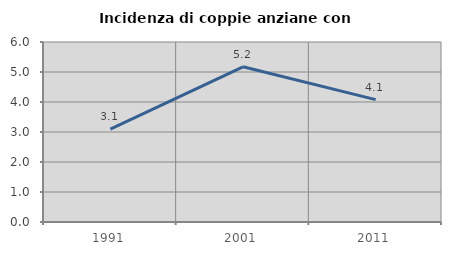
| Category | Incidenza di coppie anziane con figli |
|---|---|
| 1991.0 | 3.093 |
| 2001.0 | 5.172 |
| 2011.0 | 4.078 |